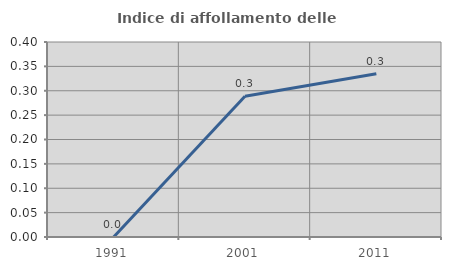
| Category | Indice di affollamento delle abitazioni  |
|---|---|
| 1991.0 | 0 |
| 2001.0 | 0.289 |
| 2011.0 | 0.335 |